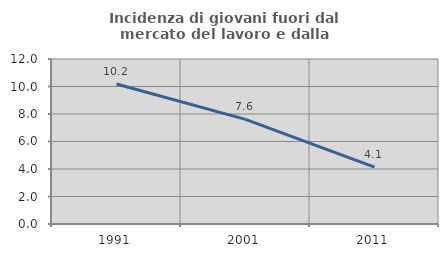
| Category | Incidenza di giovani fuori dal mercato del lavoro e dalla formazione  |
|---|---|
| 1991.0 | 10.185 |
| 2001.0 | 7.609 |
| 2011.0 | 4.132 |